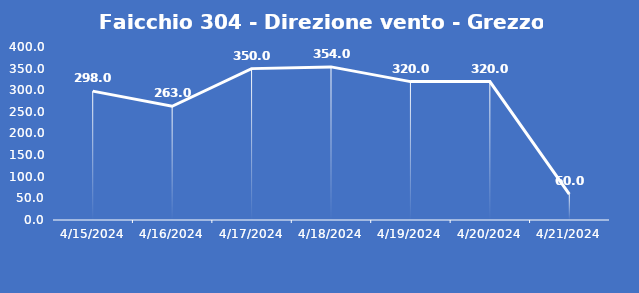
| Category | Faicchio 304 - Direzione vento - Grezzo (°N) |
|---|---|
| 4/15/24 | 298 |
| 4/16/24 | 263 |
| 4/17/24 | 350 |
| 4/18/24 | 354 |
| 4/19/24 | 320 |
| 4/20/24 | 320 |
| 4/21/24 | 60 |